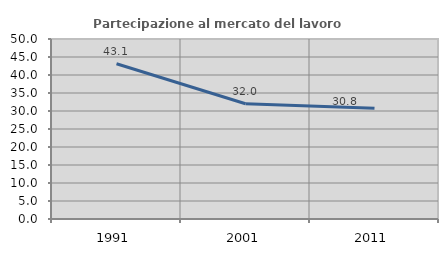
| Category | Partecipazione al mercato del lavoro  femminile |
|---|---|
| 1991.0 | 43.123 |
| 2001.0 | 32.028 |
| 2011.0 | 30.766 |